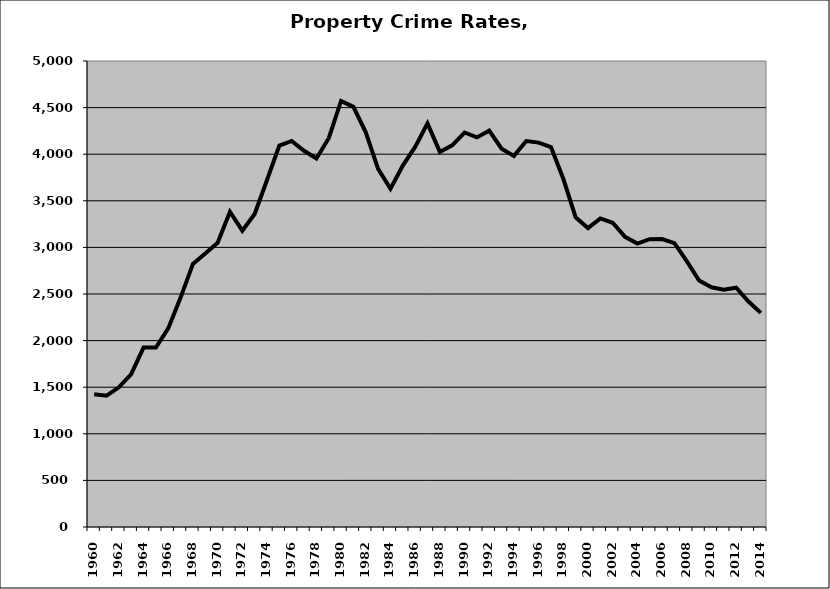
| Category | Property |
|---|---|
| 1960.0 | 1424.017 |
| 1961.0 | 1408.213 |
| 1962.0 | 1498.935 |
| 1963.0 | 1640.257 |
| 1964.0 | 1925.504 |
| 1965.0 | 1924.902 |
| 1966.0 | 2130.928 |
| 1967.0 | 2461.195 |
| 1968.0 | 2823.094 |
| 1969.0 | 2934.676 |
| 1970.0 | 3048.933 |
| 1971.0 | 3382.479 |
| 1972.0 | 3179.569 |
| 1973.0 | 3357.839 |
| 1974.0 | 3723.692 |
| 1975.0 | 4091.722 |
| 1976.0 | 4142.119 |
| 1977.0 | 4037.006 |
| 1978.0 | 3954.466 |
| 1979.0 | 4171.823 |
| 1980.0 | 4571.713 |
| 1981.0 | 4508.24 |
| 1982.0 | 4235.374 |
| 1983.0 | 3843.34 |
| 1984.0 | 3630.034 |
| 1985.0 | 3877.82 |
| 1986.0 | 4077.646 |
| 1987.0 | 4330.382 |
| 1988.0 | 4024.663 |
| 1989.0 | 4094.923 |
| 1990.0 | 4232.704 |
| 1991.0 | 4180.235 |
| 1992.0 | 4252.679 |
| 1993.0 | 4059.044 |
| 1994.0 | 3981.958 |
| 1995.0 | 4141.236 |
| 1996.0 | 4124.281 |
| 1997.0 | 4076.099 |
| 1998.0 | 3736.317 |
| 1999.0 | 3323.563 |
| 2000.0 | 3207.616 |
| 2001.0 | 3311.161 |
| 2002.0 | 3264.335 |
| 2003.0 | 3113.303 |
| 2004.0 | 3041.648 |
| 2005.0 | 3087.752 |
| 2006.0 | 3088.773 |
| 2007.0 | 3044.97 |
| 2008.0 | 2852.559 |
| 2009.0 | 2644.898 |
| 2010.0 | 2572.265 |
| 2011.0 | 2546.762 |
| 2012.0 | 2568.05 |
| 2013.0 | 2419.615 |
| 2014.0 | 2297.472 |